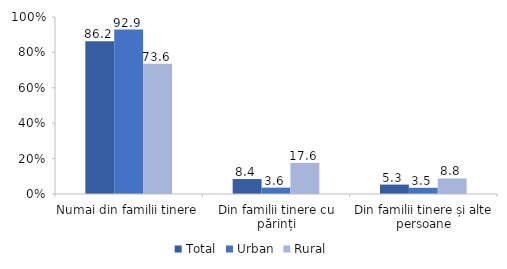
| Category | Total | Urban | Rural |
|---|---|---|---|
| Numai din familii tinere  | 86.234 | 92.888 | 73.629 |
| Din familii tinere cu părinți | 8.443 | 3.606 | 17.604 |
| Din familii tinere și alte persoane | 5.323 | 3.506 | 8.767 |